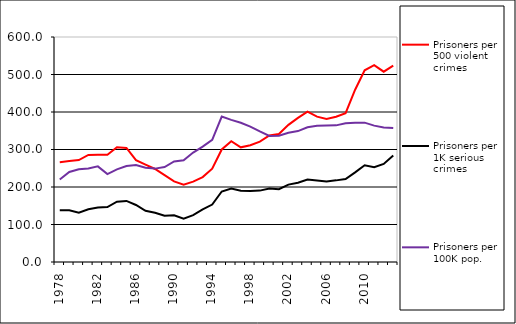
| Category | Prisoners per 500 violent crimes | Prisoners per 1K serious crimes | Prisoners per 100K pop. |
|---|---|---|---|
| 1978.0 | 266.071 | 137.711 | 219.975 |
| 1979.0 | 269.123 | 137.785 | 240.118 |
| 1980.0 | 271.842 | 131.731 | 247.379 |
| 1981.0 | 285.404 | 140.556 | 249.252 |
| 1982.0 | 285.669 | 145.279 | 255.009 |
| 1983.0 | 286.159 | 146.588 | 234.413 |
| 1984.0 | 305.787 | 160.823 | 246.861 |
| 1985.0 | 304.003 | 162.818 | 255.907 |
| 1986.0 | 271.724 | 152.045 | 258.616 |
| 1987.0 | 259.641 | 136.59 | 251.333 |
| 1988.0 | 248.084 | 131.54 | 249.019 |
| 1989.0 | 231.575 | 123.45 | 253.051 |
| 1990.0 | 214.894 | 124.419 | 267.989 |
| 1991.0 | 205.975 | 115.38 | 271.219 |
| 1992.0 | 214.217 | 125.002 | 291.758 |
| 1993.0 | 226.451 | 140.159 | 307.66 |
| 1994.0 | 248.834 | 153.205 | 325.969 |
| 1995.0 | 300.099 | 187.969 | 387.964 |
| 1996.0 | 322.177 | 195.972 | 378.957 |
| 1997.0 | 305.817 | 190.022 | 371.273 |
| 1998.0 | 311.552 | 189.624 | 361.039 |
| 1999.0 | 321.105 | 190.344 | 348.134 |
| 2000.0 | 337.607 | 196.05 | 335.967 |
| 2001.0 | 341.381 | 194.08 | 336.676 |
| 2002.0 | 365.727 | 206.364 | 344.493 |
| 2003.0 | 384.306 | 211.574 | 349.048 |
| 2004.0 | 401.148 | 220.049 | 359.266 |
| 2005.0 | 387.724 | 217.471 | 363.472 |
| 2006.0 | 381.461 | 214.656 | 363.789 |
| 2007.0 | 387.539 | 217.689 | 364.374 |
| 2008.0 | 396.904 | 221.316 | 370.158 |
| 2009.0 | 459.376 | 239.155 | 371.639 |
| 2010.0 | 511.298 | 258.011 | 371.622 |
| 2011.0 | 525.149 | 252.614 | 363.71 |
| 2012.0 | 507.53 | 261.483 | 358.86 |
| 2013.0 | 523.729 | 284.247 | 357.207 |